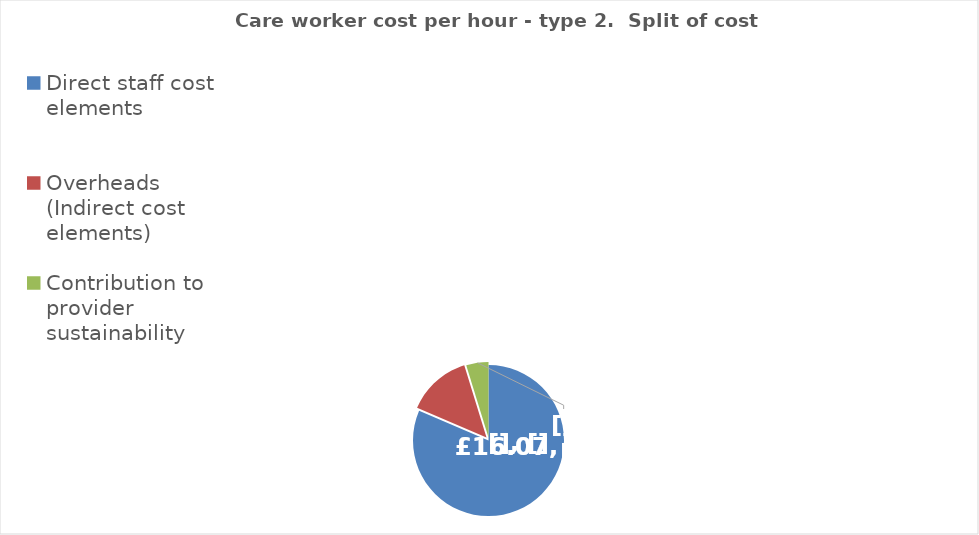
| Category | Series 0 |
|---|---|
| Direct staff cost elements | 16.075 |
| Overheads (Indirect cost elements) | 2.725 |
| Contribution to provider sustainability | 0.94 |